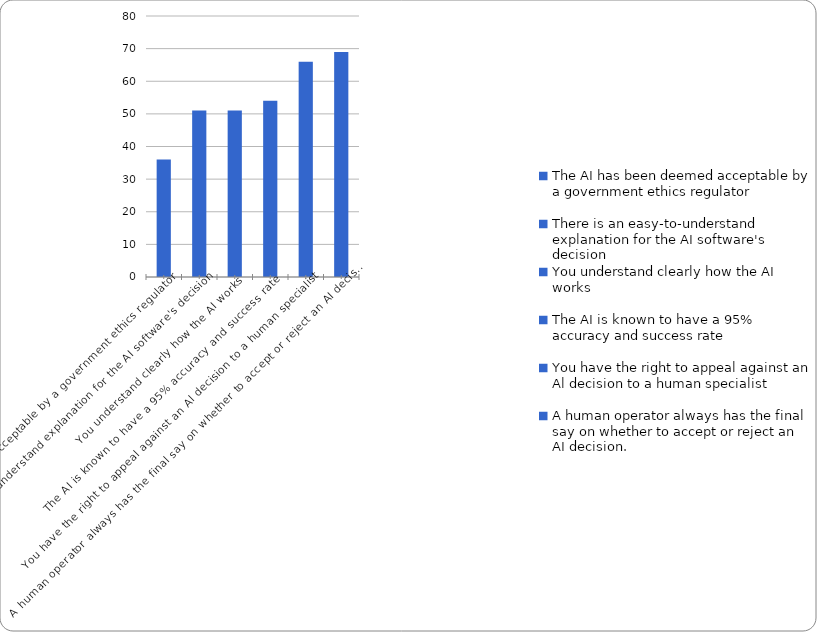
| Category | % |
|---|---|
| The AI has been deemed acceptable by a government ethics regulator | 36 |
| There is an easy-to-understand explanation for the AI software's decision | 51 |
| You understand clearly how the AI works | 51 |
| The AI is known to have a 95% accuracy and success rate | 54 |
| You have the right to appeal against an Al decision to a human specialist | 66 |
| A human operator always has the final say on whether to accept or reject an AI decision. | 69 |